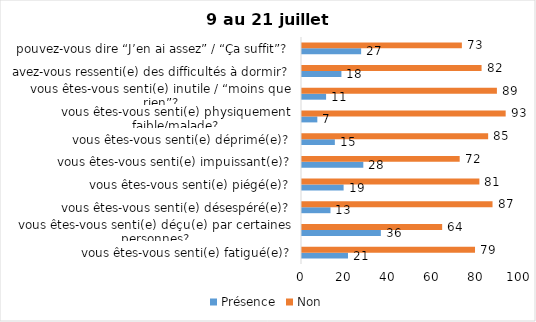
| Category | Présence | Non |
|---|---|---|
| vous êtes-vous senti(e) fatigué(e)? | 21 | 79 |
| vous êtes-vous senti(e) déçu(e) par certaines personnes? | 36 | 64 |
| vous êtes-vous senti(e) désespéré(e)? | 13 | 87 |
| vous êtes-vous senti(e) piégé(e)? | 19 | 81 |
| vous êtes-vous senti(e) impuissant(e)? | 28 | 72 |
| vous êtes-vous senti(e) déprimé(e)? | 15 | 85 |
| vous êtes-vous senti(e) physiquement faible/malade? | 7 | 93 |
| vous êtes-vous senti(e) inutile / “moins que rien”? | 11 | 89 |
| avez-vous ressenti(e) des difficultés à dormir? | 18 | 82 |
| pouvez-vous dire “J’en ai assez” / “Ça suffit”? | 27 | 73 |